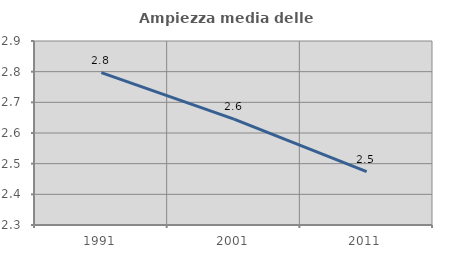
| Category | Ampiezza media delle famiglie |
|---|---|
| 1991.0 | 2.797 |
| 2001.0 | 2.645 |
| 2011.0 | 2.474 |